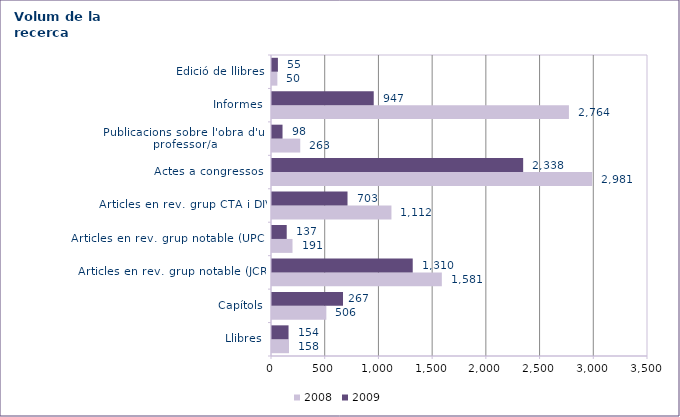
| Category | 2008 | 2009 |
|---|---|---|
| Llibres | 158 | 154 |
| Capítols | 506 | 661 |
| Articles en rev. grup notable (JCR) | 1581 | 1310 |
| Articles en rev. grup notable (UPC)  | 191 | 137 |
| Articles en rev. grup CTA i DIV | 1112 | 703 |
| Actes a congressos  | 2981 | 2338 |
| Publicacions sobre l'obra d'un professor/a | 263 | 98 |
| Informes | 2764 | 947 |
| Edició de llibres | 50 | 55 |